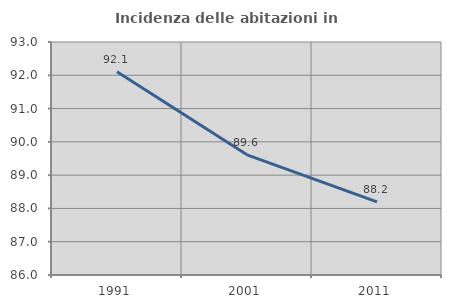
| Category | Incidenza delle abitazioni in proprietà  |
|---|---|
| 1991.0 | 92.105 |
| 2001.0 | 89.61 |
| 2011.0 | 88.194 |